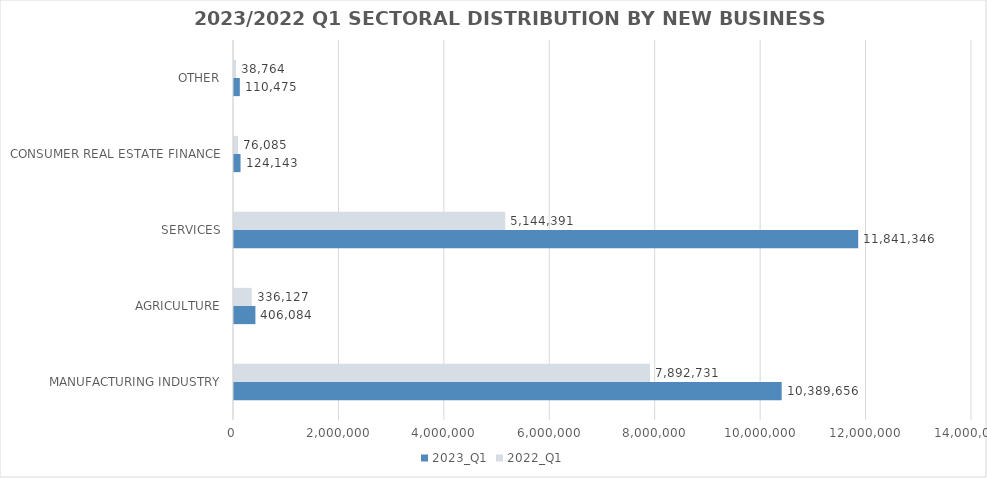
| Category | 2023_Q1 | 2022_Q1 |
|---|---|---|
| MANUFACTURING INDUSTRY | 10389655.7 | 7892731 |
| AGRICULTURE | 406084.149 | 336127 |
| SERVICES | 11841346.272 | 5144391 |
| CONSUMER REAL ESTATE FINANCE | 124143 | 76085 |
| OTHER | 110475 | 38764 |